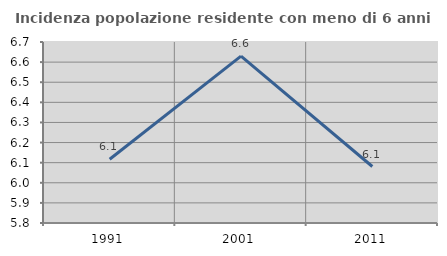
| Category | Incidenza popolazione residente con meno di 6 anni |
|---|---|
| 1991.0 | 6.117 |
| 2001.0 | 6.63 |
| 2011.0 | 6.081 |